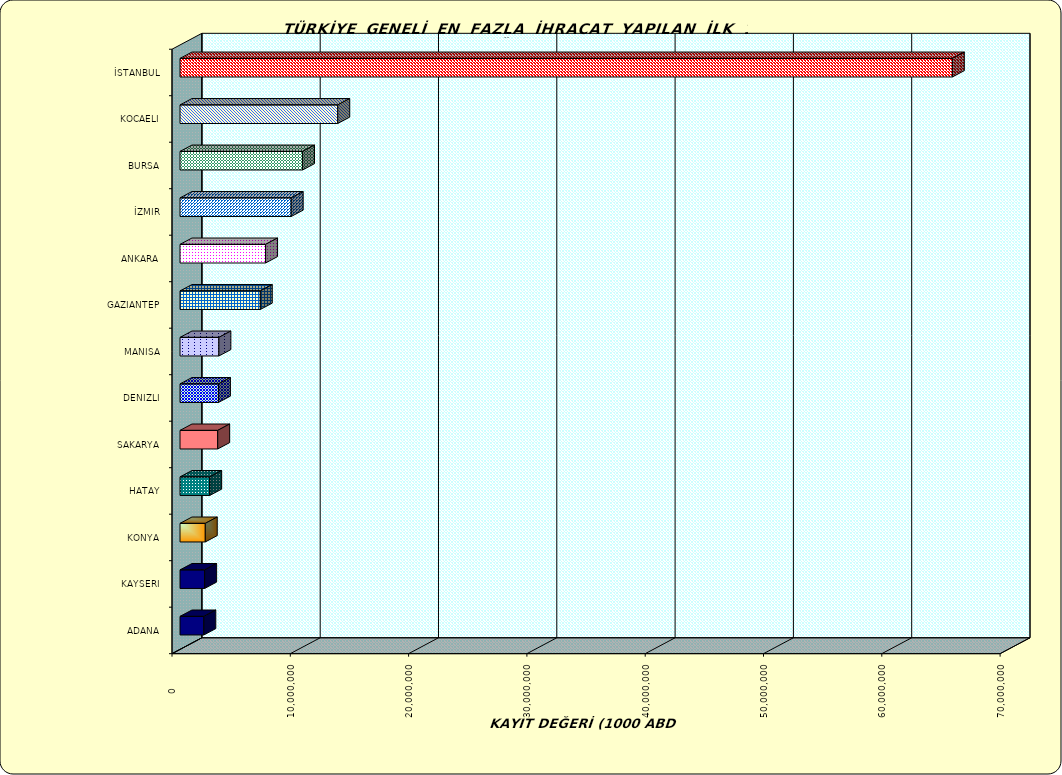
| Category | Series 0 |
|---|---|
| İSTANBUL | 65287473.4 |
| KOCAELI | 13333839.689 |
| BURSA | 10357506.965 |
| İZMIR | 9398559.406 |
| ANKARA | 7232121.713 |
| GAZIANTEP | 6787478.915 |
| MANISA | 3285996.689 |
| DENIZLI | 3248391.947 |
| SAKARYA | 3185844.241 |
| HATAY | 2509631.304 |
| KONYA | 2135876.385 |
| KAYSERI | 2083254.344 |
| ADANA | 2012399.682 |